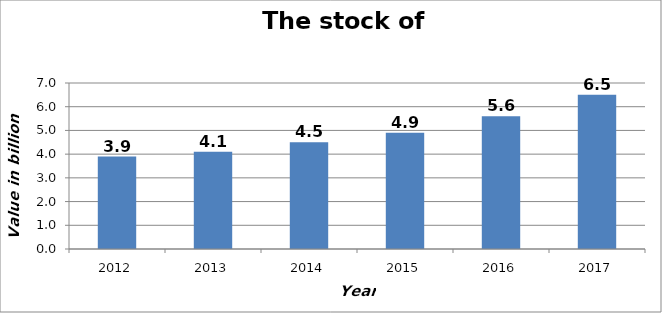
| Category | FDI in Billion Euros |
|---|---|
| 2012.0 | 3.9 |
| 2013.0 | 4.1 |
| 2014.0 | 4.5 |
| 2015.0 | 4.9 |
| 2016.0 | 5.6 |
| 2017.0 | 6.5 |